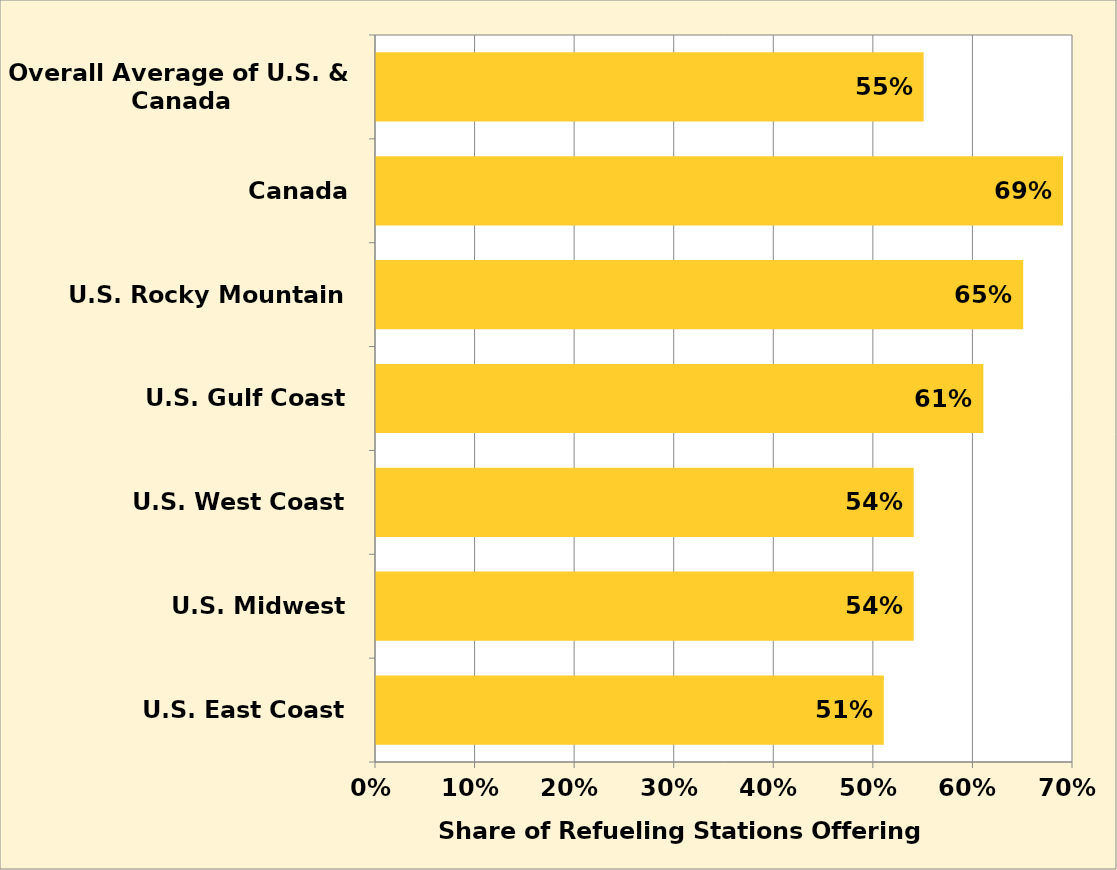
| Category | Series 0 |
|---|---|
| U.S. East Coast | 0.51 |
| U.S. Midwest | 0.54 |
| U.S. West Coast | 0.54 |
| U.S. Gulf Coast | 0.61 |
| U.S. Rocky Mountain | 0.65 |
| Canada | 0.69 |
| Overall Average of U.S. & Canada | 0.55 |